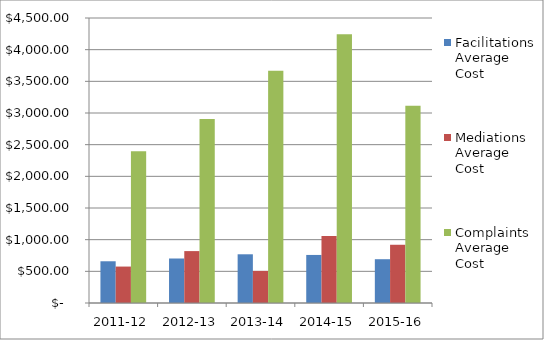
| Category | Facilitations Average Cost | Mediations Average Cost | Complaints Average Cost |
|---|---|---|---|
| 2011-12 | 658.9 | 575.35 | 2396.71 |
| 2012-13 | 702.62 | 819.54 | 2906.52 |
| 2013-14 | 769.11 | 506.264 | 3668.65 |
| 2014-15 | 758.81 | 1056.83 | 4242.4 |
| 2015-16 | 691.34 | 919.54 | 3116.22 |